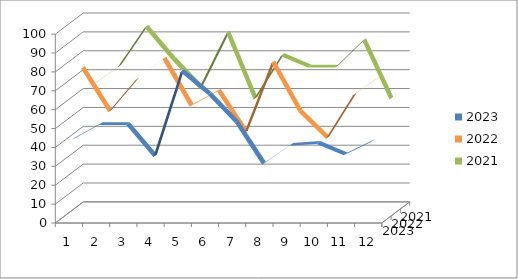
| Category | 2023 | 2022 | 2021 |
|---|---|---|---|
| 0 | 42 | 76 | 63 |
| 1 | 50 | 53 | 73 |
| 2 | 50 | 70 | 94 |
| 3 | 33 | 81 | 77 |
| 4 | 78 | 56 | 62 |
| 5 | 66 | 64 | 91 |
| 6 | 51 | 42 | 56 |
| 7 | 29 | 79 | 79 |
| 8 | 39 | 53 | 73 |
| 9 | 40 | 39 | 73 |
| 10 | 34 | 62 | 87 |
| 11 | 41 | 72 | 56 |